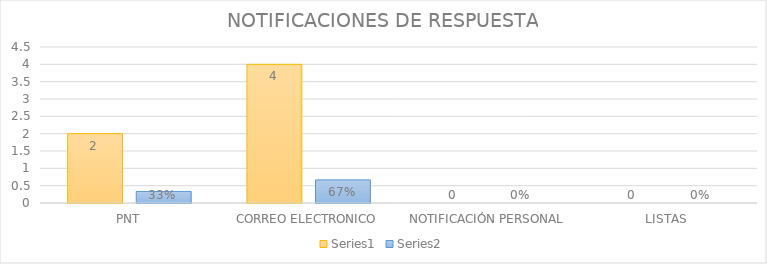
| Category | Series 3 | Series 4 |
|---|---|---|
| PNT | 2 | 0.333 |
| CORREO ELECTRONICO | 4 | 0.667 |
| NOTIFICACIÓN PERSONAL | 0 | 0 |
| LISTAS | 0 | 0 |